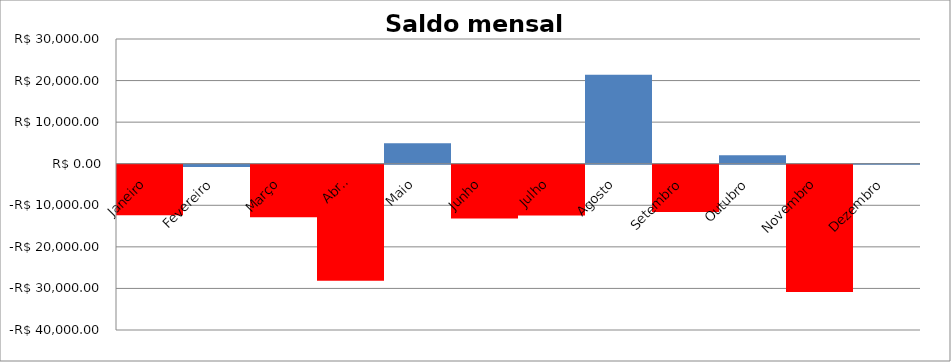
| Category | Series 44 |
|---|---|
| Janeiro | -12142.52 |
| Fevereiro | -564.46 |
| Março | -12632 |
| Abril | -27904 |
| Maio | 4905 |
| Junho | -12924 |
| Julho | -12240 |
| Agosto | 21427 |
| Setembro | -11368 |
| Outubro | 2028 |
| Novembro | -30594 |
| Dezembro | 152 |